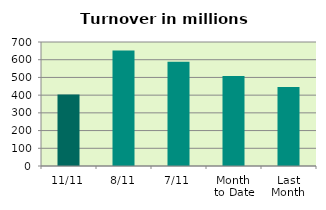
| Category | Series 0 |
|---|---|
| 11/11 | 404.284 |
| 8/11 | 651.673 |
| 7/11 | 589.103 |
| Month 
to Date | 508.499 |
| Last
Month | 446.481 |